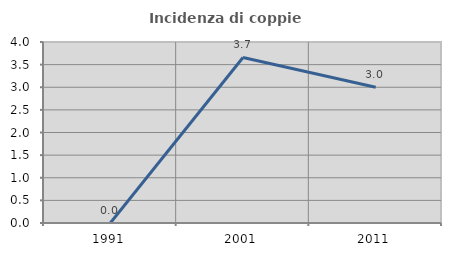
| Category | Incidenza di coppie miste |
|---|---|
| 1991.0 | 0 |
| 2001.0 | 3.659 |
| 2011.0 | 3 |